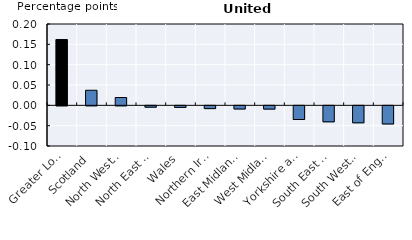
| Category | Series 0 | Series 1 | Series 2 | Series 3 |
|---|---|---|---|---|
| Greater London | 0.162 | 0 | 0 | 0 |
| Scotland | 0 | 0 | 0.037 | 0 |
| North West England | 0 | 0 | 0.019 | 0 |
| North East England | 0 | 0 | 0 | -0.003 |
| Wales | 0 | 0 | 0 | -0.004 |
| Northern Ireland | 0 | 0 | 0 | -0.007 |
| East Midlands | 0 | 0 | 0 | -0.008 |
| West Midlands | 0 | 0 | 0 | -0.008 |
| Yorkshire and The Humber | 0 | 0 | 0 | -0.034 |
| South East England | 0 | 0 | 0 | -0.039 |
| South West England | 0 | 0 | 0 | -0.042 |
| East of England | 0 | 0 | 0 | -0.045 |